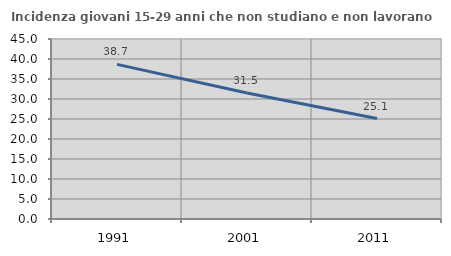
| Category | Incidenza giovani 15-29 anni che non studiano e non lavorano  |
|---|---|
| 1991.0 | 38.655 |
| 2001.0 | 31.513 |
| 2011.0 | 25.122 |